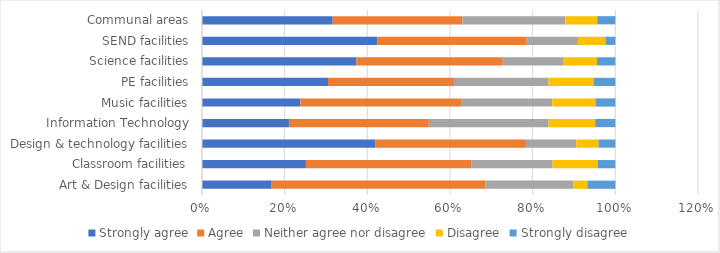
| Category | Strongly agree | Agree | Neither agree nor disagree | Disagree | Strongly disagree |
|---|---|---|---|---|---|
| Art & Design facilities | 0.169 | 0.517 | 0.213 | 0.034 | 0.067 |
| Classroom facilities | 0.251 | 0.401 | 0.196 | 0.109 | 0.043 |
| Design & technology facilities | 0.419 | 0.365 | 0.122 | 0.054 | 0.041 |
| Information Technology | 0.21 | 0.338 | 0.29 | 0.113 | 0.049 |
| Music facilities | 0.238 | 0.39 | 0.219 | 0.105 | 0.048 |
| PE facilities | 0.305 | 0.305 | 0.229 | 0.11 | 0.052 |
| Science facilities | 0.373 | 0.354 | 0.146 | 0.082 | 0.044 |
| SEND facilities | 0.424 | 0.362 | 0.124 | 0.067 | 0.024 |
| Communal areas | 0.316 | 0.314 | 0.249 | 0.077 | 0.044 |